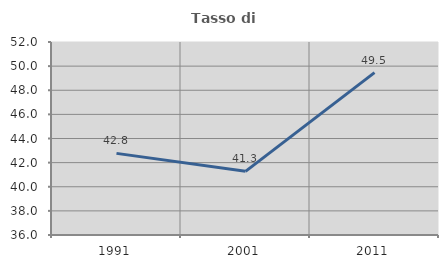
| Category | Tasso di occupazione   |
|---|---|
| 1991.0 | 42.767 |
| 2001.0 | 41.279 |
| 2011.0 | 49.457 |